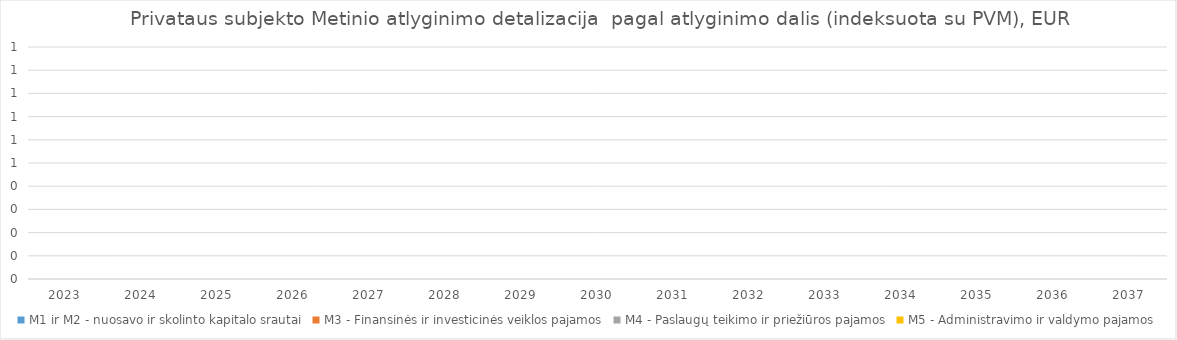
| Category | M1 ir M2 - nuosavo ir skolinto kapitalo srautai | M3 - Finansinės ir investicinės veiklos pajamos | M4 - Paslaugų teikimo ir priežiūros pajamos | M5 - Administravimo ir valdymo pajamos |
|---|---|---|---|---|
| 2023.0 | 0 | 0 | 0 | 0 |
| 2024.0 | 0 | 0 | 0 | 0 |
| 2025.0 | 0 | 0 | 0 | 0 |
| 2026.0 | 0 | 0 | 0 | 0 |
| 2027.0 | 0 | 0 | 0 | 0 |
| 2028.0 | 0 | 0 | 0 | 0 |
| 2029.0 | 0 | 0 | 0 | 0 |
| 2030.0 | 0 | 0 | 0 | 0 |
| 2031.0 | 0 | 0 | 0 | 0 |
| 2032.0 | 0 | 0 | 0 | 0 |
| 2033.0 | 0 | 0 | 0 | 0 |
| 2034.0 | 0 | 0 | 0 | 0 |
| 2035.0 | 0 | 0 | 0 | 0 |
| 2036.0 | 0 | 0 | 0 | 0 |
| 2037.0 | 0 | 0 | 0 | 0 |